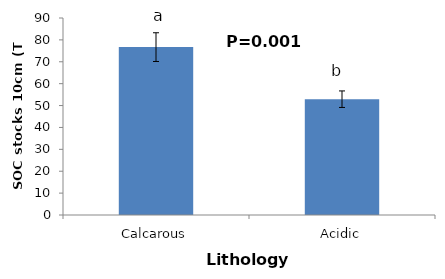
| Category | Series 0 |
|---|---|
| Calcarous | 76.694 |
| Acidic | 52.909 |